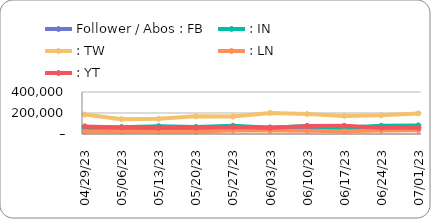
| Category | Follower / Abos : FB | : IN | : TW | : LN | : YT |
|---|---|---|---|---|---|
| 2023-07-01 | 60769.6 | 81952.147 | 196314.747 | 34910.689 | 59033.326 |
| 2023-06-24 | 47522.728 | 78326.617 | 177723.552 | 33643.801 | 59088.501 |
| 2023-06-17 | 47580.473 | 60495.172 | 172195.996 | 25920.029 | 77488.198 |
| 2023-06-10 | 58838.956 | 76658.754 | 190077.845 | 30887.65 | 75313.863 |
| 2023-06-03 | 61535.371 | 59207.006 | 200461.174 | 33439.762 | 57876.511 |
| 2023-05-27 | 63618.881 | 77658.91 | 166725.344 | 33652.194 | 66470.762 |
| 2023-05-20 | 51001.398 | 67061.413 | 168413.128 | 23699.373 | 58597.351 |
| 2023-05-13 | 49918.712 | 74072.927 | 144281.18 | 24283.038 | 57326.005 |
| 2023-05-06 | 44074.227 | 64996.21 | 141037.527 | 24851.492 | 62447.339 |
| 2023-04-29 | 61989.026 | 60518.1 | 184916.416 | 23765.962 | 72495.64 |